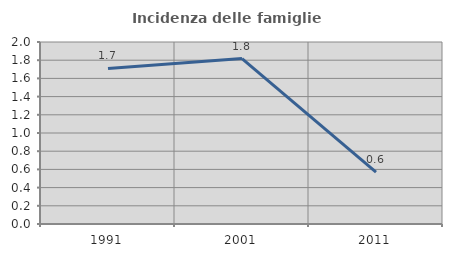
| Category | Incidenza delle famiglie numerose |
|---|---|
| 1991.0 | 1.709 |
| 2001.0 | 1.818 |
| 2011.0 | 0.57 |